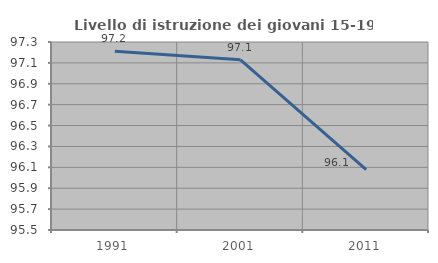
| Category | Livello di istruzione dei giovani 15-19 anni |
|---|---|
| 1991.0 | 97.211 |
| 2001.0 | 97.129 |
| 2011.0 | 96.078 |